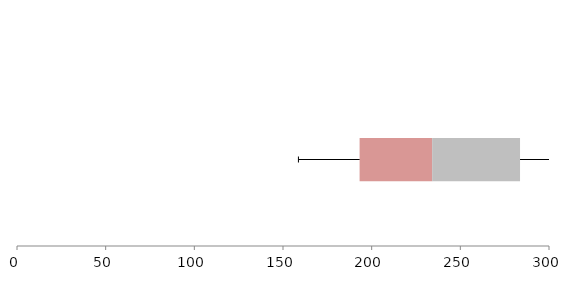
| Category | Series 1 | Series 2 | Series 3 |
|---|---|---|---|
| 0 | 193.197 | 40.913 | 49.55 |